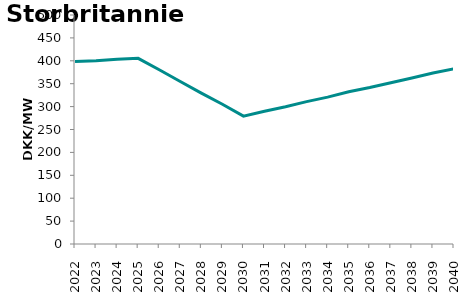
| Category | Series 2 |
|---|---|
| 2022.0 | 398.349 |
| 2023.0 | 400.048 |
| 2024.0 | 403.331 |
| 2025.0 | 405.429 |
| 2026.0 | 380.399 |
| 2027.0 | 354.731 |
| 2028.0 | 329.324 |
| 2029.0 | 305.208 |
| 2030.0 | 279.115 |
| 2031.0 | 289.725 |
| 2032.0 | 299.587 |
| 2033.0 | 310.858 |
| 2034.0 | 320.711 |
| 2035.0 | 332.417 |
| 2036.0 | 341.694 |
| 2037.0 | 352.199 |
| 2038.0 | 362.299 |
| 2039.0 | 373.344 |
| 2040.0 | 382.518 |